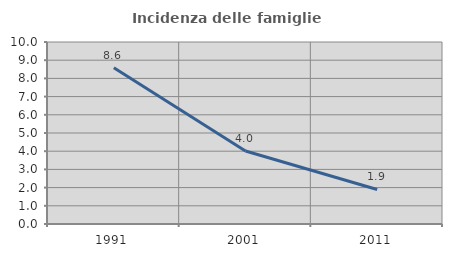
| Category | Incidenza delle famiglie numerose |
|---|---|
| 1991.0 | 8.59 |
| 2001.0 | 4.009 |
| 2011.0 | 1.896 |